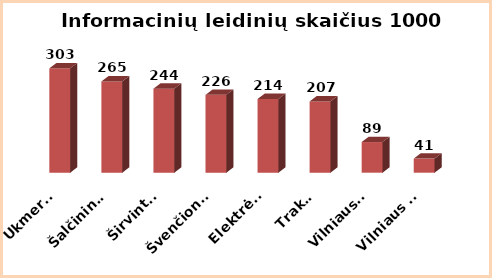
| Category | Series 0 |
|---|---|
| Ukmergė | 303 |
| Šalčininkai | 265 |
| Širvintos | 244 |
| Švenčionys | 226 |
| Elektrėnai | 214 |
| Trakai | 207 |
| Vilniaus r. | 89 |
| Vilniaus m. | 41 |